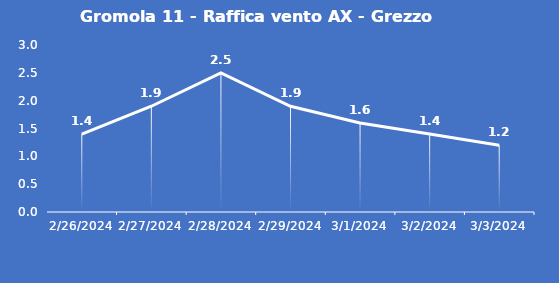
| Category | Gromola 11 - Raffica vento AX - Grezzo (m/s) |
|---|---|
| 2/26/24 | 1.4 |
| 2/27/24 | 1.9 |
| 2/28/24 | 2.5 |
| 2/29/24 | 1.9 |
| 3/1/24 | 1.6 |
| 3/2/24 | 1.4 |
| 3/3/24 | 1.2 |